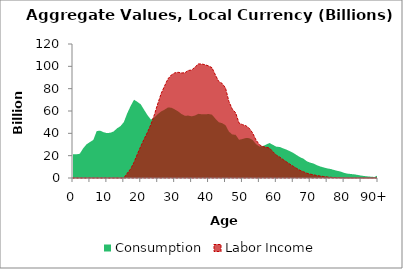
| Category | Consumption | Labor Income |
|---|---|---|
| 0 | 21177.019 | 0 |
|  | 21227.807 | 0 |
| 2 | 21733.489 | 0 |
| 3 | 26577.421 | 0 |
| 4 | 30171.735 | 0 |
| 5 | 32199.746 | 0 |
| 6 | 34124.041 | 0 |
| 7 | 42062.947 | 0 |
| 8 | 42385.242 | 0 |
| 9 | 41024.613 | 0 |
| 10 | 40220.784 | 0 |
| 11 | 40526.601 | 0 |
| 12 | 41693.615 | 0 |
| 13 | 44492.3 | 0 |
| 14 | 46428.014 | 0 |
| 15 | 50061.13 | 0 |
| 16 | 57939.291 | 4171.715 |
| 17 | 64457.161 | 8115.852 |
| 18 | 70092.111 | 14045.495 |
| 19 | 68198.743 | 21361.174 |
| 20 | 65957.57 | 28368.291 |
| 21 | 60988.017 | 34915.613 |
| 22 | 56189.671 | 41078.24 |
| 23 | 52270.571 | 48098.427 |
| 24 | 54204.525 | 56554.918 |
| 25 | 57173.159 | 66378.223 |
| 26 | 59577.522 | 75520.819 |
| 27 | 61159.163 | 82214.08 |
| 28 | 63158.944 | 88686.964 |
| 29 | 62961.596 | 92201.969 |
| 30 | 61457.01 | 94100.562 |
| 31 | 59706.327 | 94671.118 |
| 32 | 57314.581 | 94089.339 |
| 33 | 55762.095 | 94192.596 |
| 34 | 55889.236 | 96323.714 |
| 35 | 55223.82 | 96647.276 |
| 36 | 55950.397 | 99286.019 |
| 37 | 57465.313 | 102157.577 |
| 38 | 57070.947 | 102084.83 |
| 39 | 56998.207 | 101418.549 |
| 40 | 57339.517 | 100374.087 |
| 41 | 56719.713 | 98806.382 |
| 42 | 53197.287 | 92384.78 |
| 43 | 49953.76 | 86450.552 |
| 44 | 49110.636 | 84676.901 |
| 45 | 47305.991 | 80653.432 |
| 46 | 41599.312 | 68605.145 |
| 47 | 38970.978 | 61703.076 |
| 48 | 38656.033 | 58347.716 |
| 49 | 34185.438 | 49168.892 |
| 50 | 34933.319 | 47820.351 |
| 51 | 35820.666 | 46855.165 |
| 52 | 35678.801 | 44559.655 |
| 53 | 34038.97 | 40369.136 |
| 54 | 30415.38 | 34095.318 |
| 55 | 28217.053 | 29798.061 |
| 56 | 28504.567 | 28137.144 |
| 57 | 30005.185 | 27545.938 |
| 58 | 31301.537 | 26764.429 |
| 59 | 29688.808 | 23523.797 |
| 60 | 28012.375 | 20473.794 |
| 61 | 27797.175 | 18718.964 |
| 62 | 26550.987 | 16483.31 |
| 63 | 25409.933 | 14448.346 |
| 64 | 24008.094 | 12368.955 |
| 65 | 22474.315 | 10495.124 |
| 66 | 20519.823 | 8597.024 |
| 67 | 18629.487 | 6851.881 |
| 68 | 17284.274 | 5589.75 |
| 69 | 14988.657 | 4281.598 |
| 70 | 13757.939 | 3440.325 |
| 71 | 12949.456 | 2847.41 |
| 72 | 11380.898 | 2206.84 |
| 73 | 10313.791 | 1705.946 |
| 74 | 9409.415 | 1325.821 |
| 75 | 8611.797 | 933.568 |
| 76 | 8104.461 | 637.102 |
| 77 | 7216.91 | 387.006 |
| 78 | 6417.966 | 237.23 |
| 79 | 5744.154 | 147.597 |
| 80 | 4597.555 | 50.972 |
| 81 | 3912.074 | 51.915 |
| 82 | 3563.397 | 44.131 |
| 83 | 3297.292 | 31.176 |
| 84 | 2776.811 | 17.729 |
| 85 | 2189.431 | 6.865 |
| 86 | 1746.953 | 1.302 |
| 87 | 1428.288 | 0 |
| 88 | 1148.87 | 0 |
| 89 | 898.022 | 0 |
| 90+ | 2547.965 | 0 |